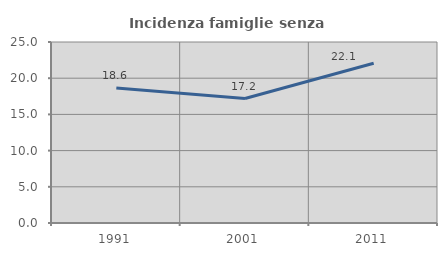
| Category | Incidenza famiglie senza nuclei |
|---|---|
| 1991.0 | 18.64 |
| 2001.0 | 17.194 |
| 2011.0 | 22.059 |